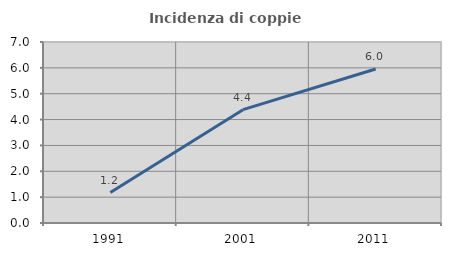
| Category | Incidenza di coppie miste |
|---|---|
| 1991.0 | 1.178 |
| 2001.0 | 4.382 |
| 2011.0 | 5.954 |